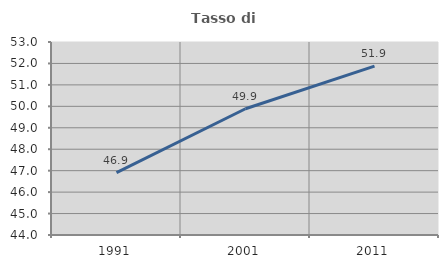
| Category | Tasso di occupazione   |
|---|---|
| 1991.0 | 46.911 |
| 2001.0 | 49.888 |
| 2011.0 | 51.873 |